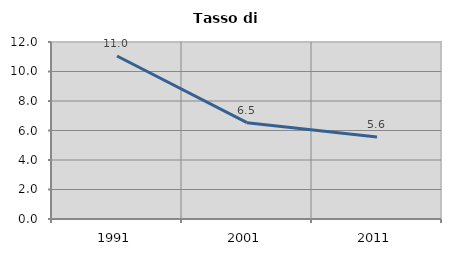
| Category | Tasso di disoccupazione   |
|---|---|
| 1991.0 | 11.05 |
| 2001.0 | 6.529 |
| 2011.0 | 5.562 |